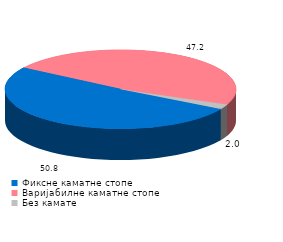
| Category | Series 0 |
|---|---|
| Фиксне каматне стопе | 50.8 |
| Варијабилне каматне стопе | 47.2 |
| Без камате | 2 |